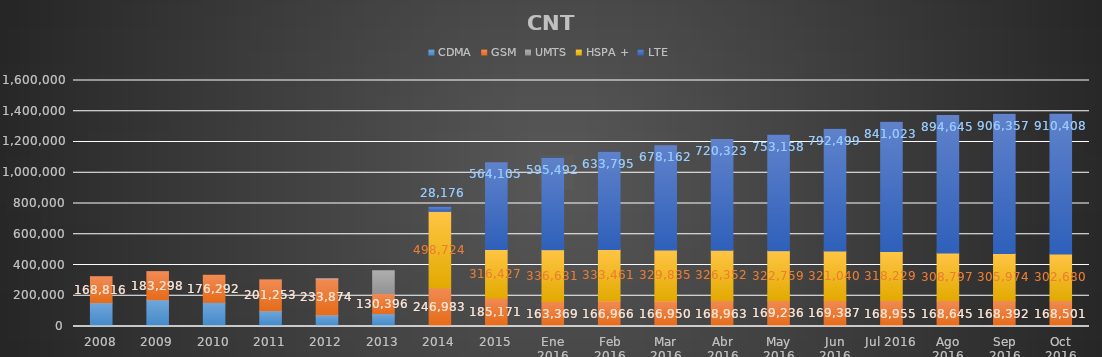
| Category | CDMA | GSM | UMTS | HSPA + | LTE |
|---|---|---|---|---|---|
| 2008 | 155151 | 168816 | 0 | 0 | 0 |
| 2009 | 173602 | 183298 | 0 | 0 | 0 |
| 2010 | 157438 | 176292 | 0 | 0 | 0 |
| 2011 | 102115 | 201253 | 0 | 0 | 0 |
| 2012 | 75179 | 233874 | 218 | 0 | 0 |
| 2013 | 83748 | 130396 | 148416 | 0 | 0 |
| 2014 | 3009 | 246983 | 0 | 498724 | 28176 |
| 2015 | 0 | 185171 | 0 | 316427 | 564105 |
| Ene 2016 | 0 | 163369 | 0 | 336631 | 595492 |
| Feb 2016 | 0 | 166966 | 0 | 333461 | 633795 |
| Mar 2016 | 0 | 166950 | 0 | 329835 | 678162 |
| Abr 2016 | 0 | 168963 | 0 | 326352 | 720323 |
| May 2016 | 0 | 169236 | 0 | 322759 | 753158 |
| Jun 2016 | 0 | 169387 | 0 | 321040 | 792499 |
| Jul 2016 | 0 | 168955 | 0 | 318229 | 841023 |
| Ago 2016 | 0 | 168645 | 0 | 308797 | 894645 |
| Sep 2016 | 0 | 168392 | 0 | 305974 | 906357 |
| Oct 2016 | 0 | 168501 | 0 | 302680 | 910408 |